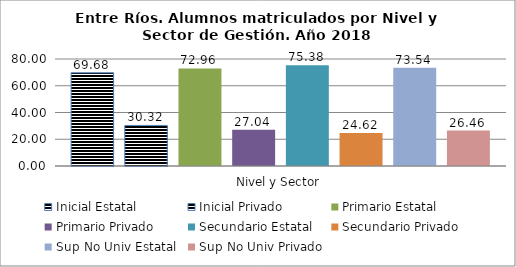
| Category | Inicial Estatal | Inicial Privado | Primario Estatal | Primario Privado | Secundario Estatal | Secundario Privado | Sup No Univ Estatal | Sup No Univ Privado |
|---|---|---|---|---|---|---|---|---|
| 0 | 69.677 | 30.323 | 72.958 | 27.042 | 75.381 | 24.619 | 73.542 | 26.458 |